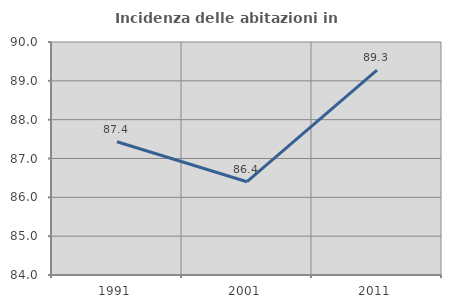
| Category | Incidenza delle abitazioni in proprietà  |
|---|---|
| 1991.0 | 87.43 |
| 2001.0 | 86.402 |
| 2011.0 | 89.275 |